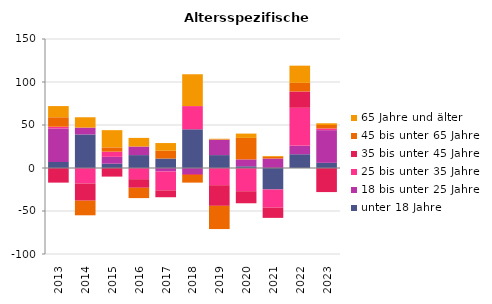
| Category | unter 18 Jahre | 18 bis unter 25 Jahre | 25 bis unter 35 Jahre | 35 bis unter 45 Jahre | 45 bis unter 65 Jahre | 65 Jahre und älter |
|---|---|---|---|---|---|---|
| 2013.0 | 7 | 39 | 2 | -17 | 11 | 13 |
| 2014.0 | 39 | 8 | -18 | -20 | -17 | 12 |
| 2015.0 | 5 | 8 | 6 | -10 | 5 | 20 |
| 2016.0 | 15 | 10 | -13 | -10 | -12 | 10 |
| 2017.0 | 11 | -4 | -22 | -8 | 9 | 9 |
| 2018.0 | 45 | -7 | 27 | -1 | -9 | 37 |
| 2019.0 | 15 | 18 | -20 | -24 | -27 | 1 |
| 2020.0 | 2 | 8 | -27 | -14 | 25 | 5 |
| 2021.0 | -25 | 11 | -21 | -12 | 2 | 1 |
| 2022.0 | 16 | 10 | 44 | 19 | 10 | 20 |
| 2023.0 | 6 | 38 | 2 | -28 | 4 | 2 |